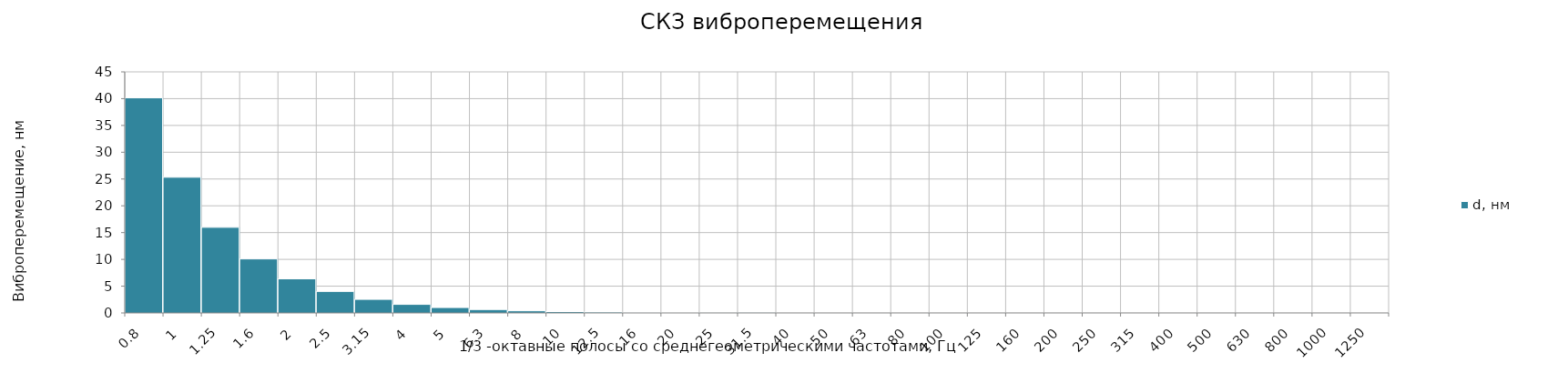
| Category | d, нм |
|---|---|
| 0.8 | 40.152 |
| 1.0 | 25.332 |
| 1.25 | 15.984 |
| 1.6 | 10.085 |
| 2.0 | 6.363 |
| 2.5 | 4.015 |
| 3.15 | 2.533 |
| 4.0 | 1.598 |
| 5.0 | 1.008 |
| 6.3 | 0.636 |
| 8.0 | 0.401 |
| 10.0 | 0.253 |
| 12.5 | 0.16 |
| 16.0 | 0.101 |
| 20.0 | 0.064 |
| 25.0 | 0.04 |
| 31.5 | 0.025 |
| 40.0 | 0.016 |
| 50.0 | 0.01 |
| 63.0 | 0.006 |
| 80.0 | 0.004 |
| 100.0 | 0.003 |
| 125.0 | 0.002 |
| 160.0 | 0.001 |
| 200.0 | 0.001 |
| 250.0 | 0 |
| 315.0 | 0 |
| 400.0 | 0 |
| 500.0 | 0 |
| 630.0 | 0 |
| 800.0 | 0 |
| 1000.0 | 0 |
| 1250.0 | 0 |